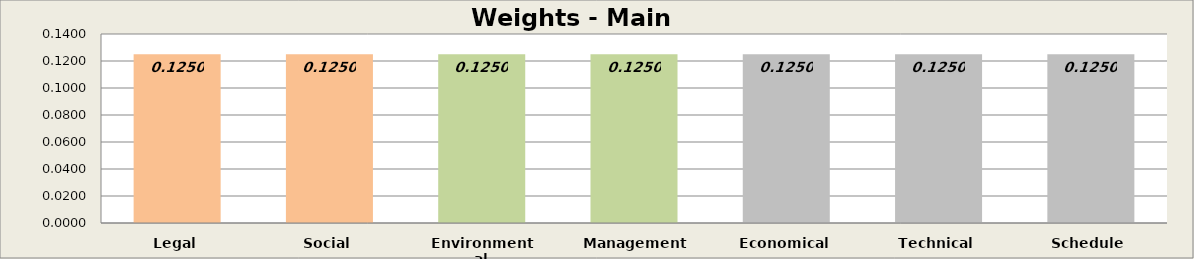
| Category | Main Modules |
|---|---|
| Legal | 0.125 |
| Social | 0.125 |
| Environmental | 0.125 |
| Management | 0.125 |
| Economical | 0.125 |
| Technical | 0.125 |
| Schedule | 0.125 |